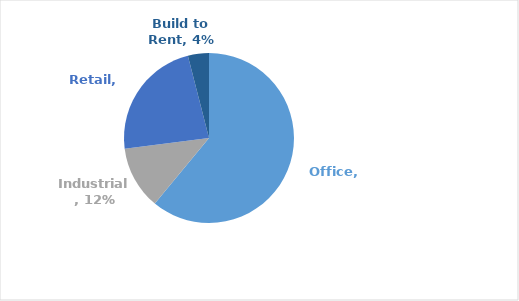
| Category | Series 0 |
|---|---|
| Office | 0.61 |
| Industrial | 0.12 |
| Retail | 0.23 |
| Build to Rent | 0.04 |